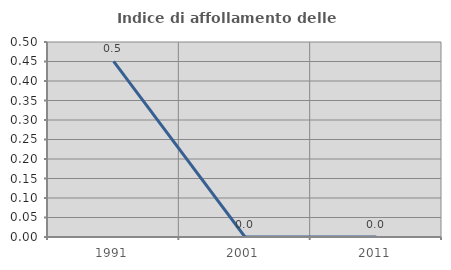
| Category | Indice di affollamento delle abitazioni  |
|---|---|
| 1991.0 | 0.45 |
| 2001.0 | 0 |
| 2011.0 | 0 |